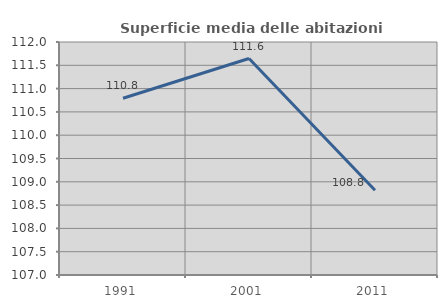
| Category | Superficie media delle abitazioni occupate |
|---|---|
| 1991.0 | 110.792 |
| 2001.0 | 111.645 |
| 2011.0 | 108.82 |